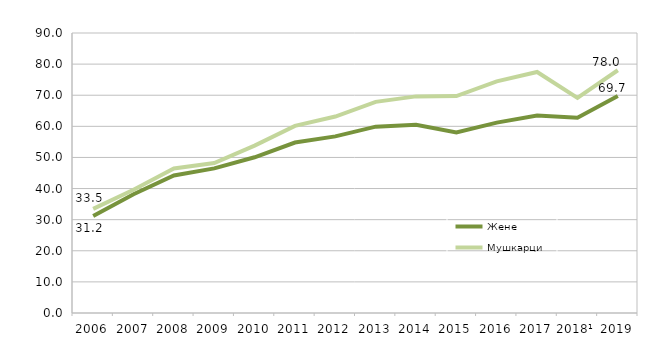
| Category | Жене | Мушкарци |
|---|---|---|
| 2006 | 31.204 | 33.453 |
| 2007 | 38.179 | 39.626 |
| 2008 | 44.188 | 46.434 |
| 2009 | 46.489 | 48.197 |
| 2010 | 50.049 | 53.792 |
| 2011 | 54.792 | 60.148 |
| 2012 | 56.765 | 63.157 |
| 2013 | 59.891 | 67.86 |
| 2014 | 60.498 | 69.624 |
| 2015 | 58.063 | 69.725 |
| 2016 | 61.203 | 74.447 |
| 2017 | 63.49 | 77.466 |
| 2018¹ | 62.792 | 69.12 |
| 2019 | 69.73 | 78.029 |